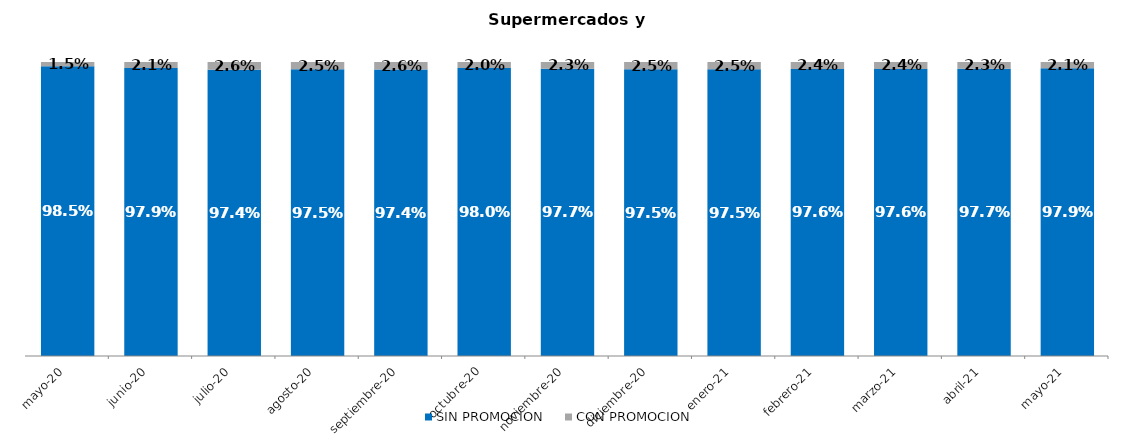
| Category | SIN PROMOCION   | CON PROMOCION   |
|---|---|---|
| 2020-05-01 | 0.985 | 0.015 |
| 2020-06-01 | 0.979 | 0.021 |
| 2020-07-01 | 0.974 | 0.026 |
| 2020-08-01 | 0.975 | 0.025 |
| 2020-09-01 | 0.974 | 0.026 |
| 2020-10-01 | 0.98 | 0.02 |
| 2020-11-01 | 0.977 | 0.023 |
| 2020-12-01 | 0.975 | 0.025 |
| 2021-01-01 | 0.975 | 0.025 |
| 2021-02-01 | 0.976 | 0.024 |
| 2021-03-01 | 0.976 | 0.024 |
| 2021-04-01 | 0.977 | 0.023 |
| 2021-05-01 | 0.979 | 0.021 |